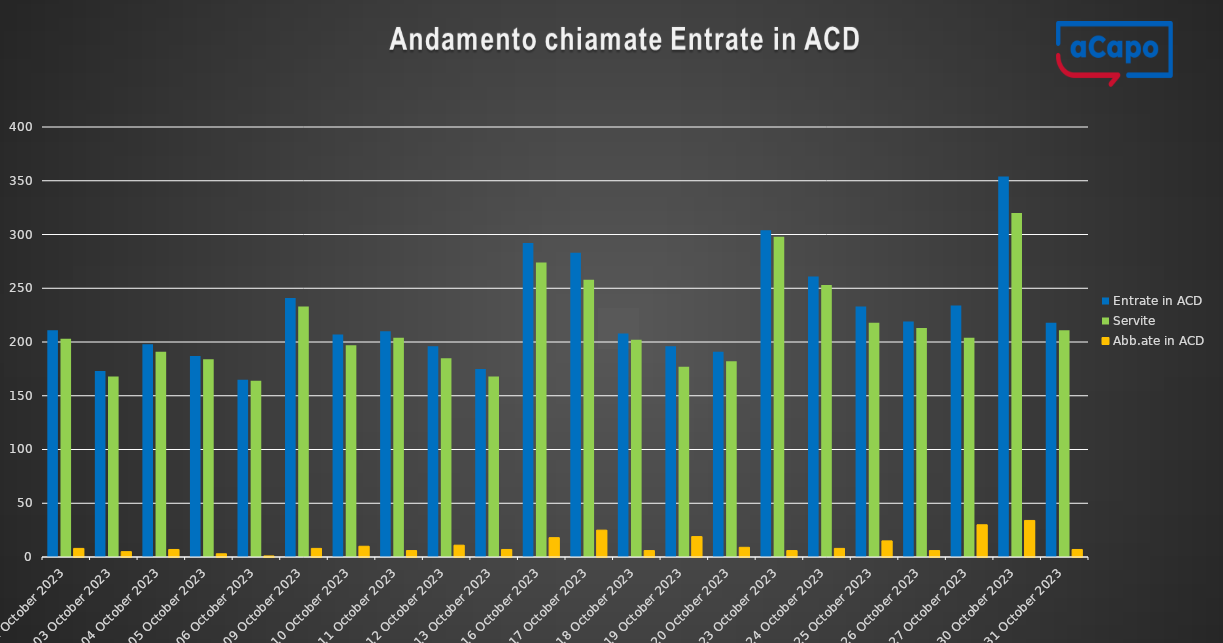
| Category | Entrate in ACD | Servite | Abb.ate in ACD |
|---|---|---|---|
| 2023-10-02 | 211 | 203 | 8 |
| 2023-10-03 | 173 | 168 | 5 |
| 2023-10-04 | 198 | 191 | 7 |
| 2023-10-05 | 187 | 184 | 3 |
| 2023-10-06 | 165 | 164 | 1 |
| 2023-10-09 | 241 | 233 | 8 |
| 2023-10-10 | 207 | 197 | 10 |
| 2023-10-11 | 210 | 204 | 6 |
| 2023-10-12 | 196 | 185 | 11 |
| 2023-10-13 | 175 | 168 | 7 |
| 2023-10-16 | 292 | 274 | 18 |
| 2023-10-17 | 283 | 258 | 25 |
| 2023-10-18 | 208 | 202 | 6 |
| 2023-10-19 | 196 | 177 | 19 |
| 2023-10-20 | 191 | 182 | 9 |
| 2023-10-23 | 304 | 298 | 6 |
| 2023-10-24 | 261 | 253 | 8 |
| 2023-10-25 | 233 | 218 | 15 |
| 2023-10-26 | 219 | 213 | 6 |
| 2023-10-27 | 234 | 204 | 30 |
| 2023-10-30 | 354 | 320 | 34 |
| 2023-10-31 | 218 | 211 | 7 |